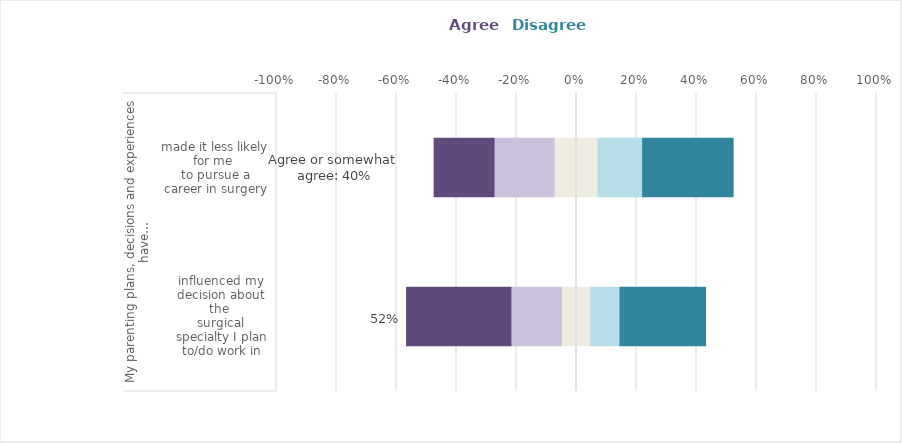
| Category | Neither agree nor disagree | Somewhat agree | Agree | Somewhat disagree | Disagree |
|---|---|---|---|---|---|
| 0 | 0.047 | -0.168 | -0.352 | 0.098 | 0.289 |
| 1 | 0.071 | -0.2 | -0.203 | 0.149 | 0.305 |